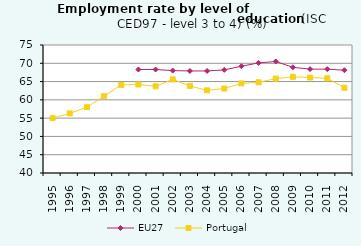
| Category | EU27 | Portugal |
|---|---|---|
| 1995.0 | 0 | 55 |
| 1996.0 | 0 | 56.3 |
| 1997.0 | 0 | 58 |
| 1998.0 | 0 | 61 |
| 1999.0 | 0 | 64.1 |
| 2000.0 | 68.3 | 64.2 |
| 2001.0 | 68.3 | 63.7 |
| 2002.0 | 68 | 65.6 |
| 2003.0 | 67.9 | 63.8 |
| 2004.0 | 67.9 | 62.6 |
| 2005.0 | 68.2 | 63.1 |
| 2006.0 | 69.2 | 64.5 |
| 2007.0 | 70.1 | 64.8 |
| 2008.0 | 70.5 | 65.8 |
| 2009.0 | 68.9 | 66.3 |
| 2010.0 | 68.4 | 66.1 |
| 2011.0 | 68.4 | 65.9 |
| 2012.0 | 68.1 | 63.3 |